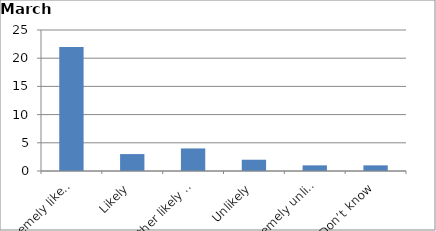
| Category | Series 0 |
|---|---|
| Extremely likely | 22 |
| Likely | 3 |
| Neither likely nor unlikely | 4 |
| Unlikely | 2 |
| Extremely unlikely | 1 |
| Don’t know | 1 |